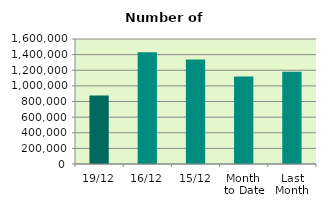
| Category | Series 0 |
|---|---|
| 19/12 | 878336 |
| 16/12 | 1429274 |
| 15/12 | 1337530 |
| Month 
to Date | 1120889.692 |
| Last
Month | 1182027.273 |